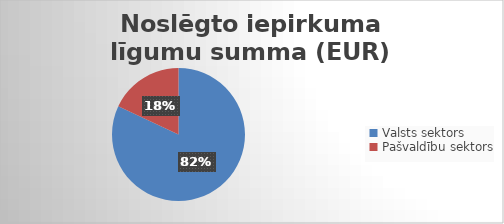
| Category | Noslēgto iepirkuma līgumu summa (EUR) bez PVN |
|---|---|
| Valsts sektors | 54801210 |
| Pašvaldību sektors | 12047646 |